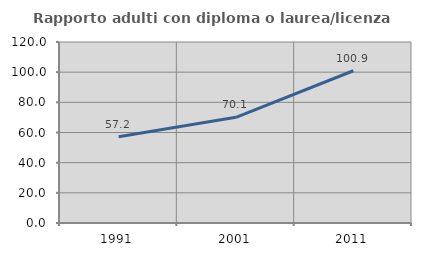
| Category | Rapporto adulti con diploma o laurea/licenza media  |
|---|---|
| 1991.0 | 57.171 |
| 2001.0 | 70.061 |
| 2011.0 | 100.94 |